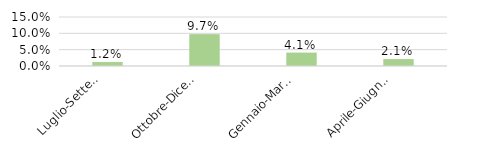
| Category | Abruzzo |
|---|---|
| Luglio-Settembre 
2020 | 0.012 |
| Ottobre-Dicembre 
2020 | 0.097 |
| Gennaio-Marzo 
2021 | 0.041 |
| Aprile-Giugno
 2021 | 0.021 |